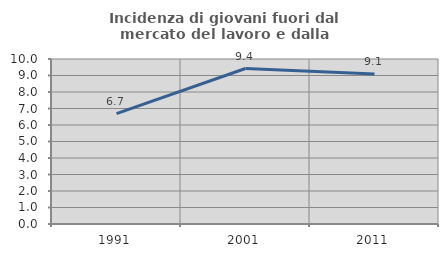
| Category | Incidenza di giovani fuori dal mercato del lavoro e dalla formazione  |
|---|---|
| 1991.0 | 6.689 |
| 2001.0 | 9.424 |
| 2011.0 | 9.091 |